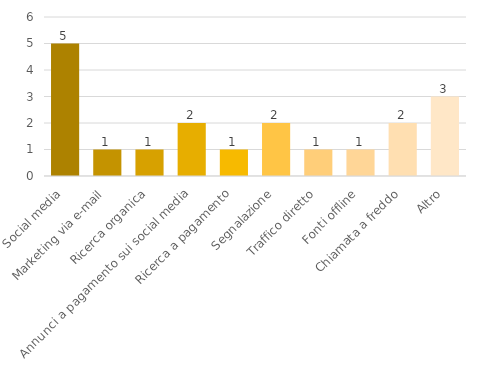
| Category | Series 0 |
|---|---|
| Social media | 5 |
| Marketing via e-mail | 1 |
| Ricerca organica | 1 |
| Annunci a pagamento sui social media | 2 |
| Ricerca a pagamento | 1 |
| Segnalazione | 2 |
| Traffico diretto | 1 |
| Fonti offline | 1 |
| Chiamata a freddo | 2 |
| Altro | 3 |